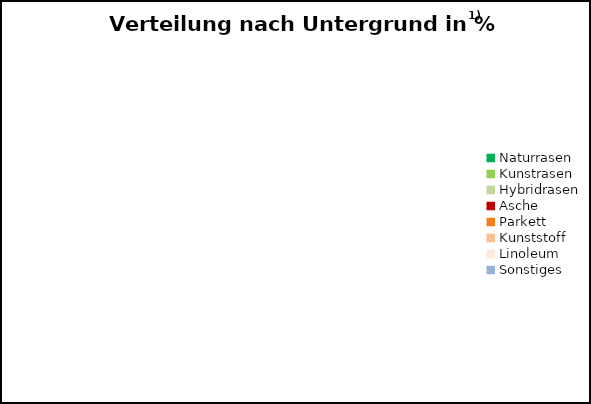
| Category | Series 0 |
|---|---|
| Naturrasen | 0 |
| Kunstrasen | 0 |
| Hybridrasen | 0 |
| Asche | 0 |
| Parkett | 0 |
| Kunststoff | 0 |
| Linoleum | 0 |
| Sonstiges | 0 |